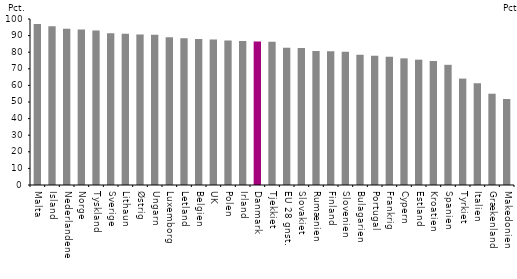
| Category | Beskæftigelsesfrekvens |
|---|---|
| Malta | 97 |
| Island | 95.7 |
| Nederlandene | 94.2 |
| Norge | 93.6 |
| Tyskland | 93.1 |
| Sverige | 91.4 |
| Lithaun | 91.1 |
| Østrig | 90.6 |
| Ungarn | 90.5 |
| Luxemborg | 89 |
| Letland | 88.4 |
| Belgien | 87.9 |
| UK | 87.6 |
| Polen | 87 |
| Irland | 86.7 |
| Danmark | 86.4 |
| Tjekkiet | 86.3 |
| EU 28 gnst. | 82.7 |
| Slovakiet | 82.5 |
| Rumænien | 80.7 |
| Finland | 80.5 |
| Slovenien | 80.2 |
| Bulagarien | 78.5 |
| Portugal | 77.8 |
| Frankrig | 77.3 |
| Cypern | 76.3 |
| Estland | 75.5 |
| Kroatien | 74.7 |
| Spanien | 72.4 |
| Tyrkiet | 64.1 |
| Italien | 61.3 |
| Grækenland | 55 |
| Makedonien | 51.8 |